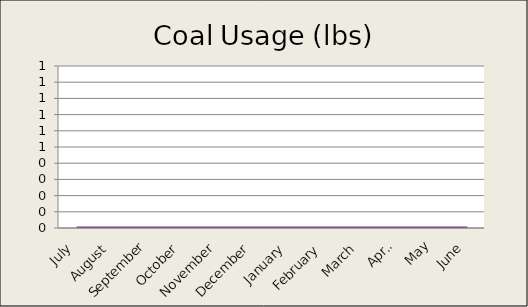
| Category | Coal Usage (lbs) |
|---|---|
| 0 | 0 |
| 1 | 0 |
| 2 | 0 |
| 3 | 0 |
| 4 | 0 |
| 5 | 0 |
| 6 | 0 |
| 7 | 0 |
| 8 | 0 |
| 9 | 0 |
| 10 | 0 |
| 11 | 0 |